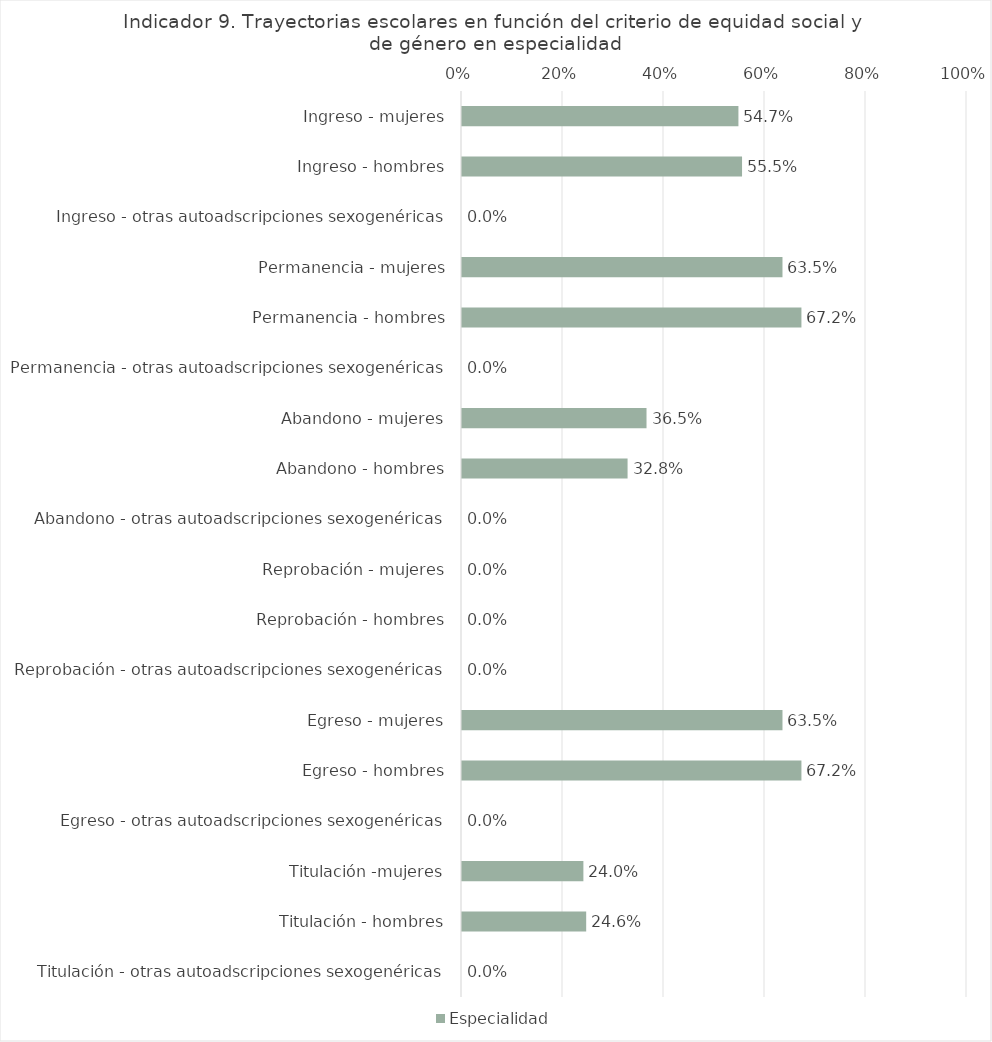
| Category | Especialidad |
|---|---|
| Ingreso - mujeres | 0.547 |
| Ingreso - hombres | 0.555 |
| Ingreso - otras autoadscripciones sexogenéricas | 0 |
| Permanencia - mujeres | 0.635 |
| Permanencia - hombres | 0.672 |
| Permanencia - otras autoadscripciones sexogenéricas | 0 |
| Abandono - mujeres | 0.365 |
| Abandono - hombres | 0.328 |
| Abandono - otras autoadscripciones sexogenéricas | 0 |
| Reprobación - mujeres | 0 |
| Reprobación - hombres | 0 |
| Reprobación - otras autoadscripciones sexogenéricas | 0 |
| Egreso - mujeres | 0.635 |
| Egreso - hombres | 0.672 |
| Egreso - otras autoadscripciones sexogenéricas | 0 |
| Titulación -mujeres | 0.24 |
| Titulación - hombres | 0.246 |
| Titulación - otras autoadscripciones sexogenéricas | 0 |